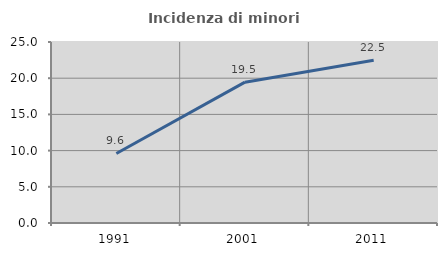
| Category | Incidenza di minori stranieri |
|---|---|
| 1991.0 | 9.607 |
| 2001.0 | 19.452 |
| 2011.0 | 22.477 |